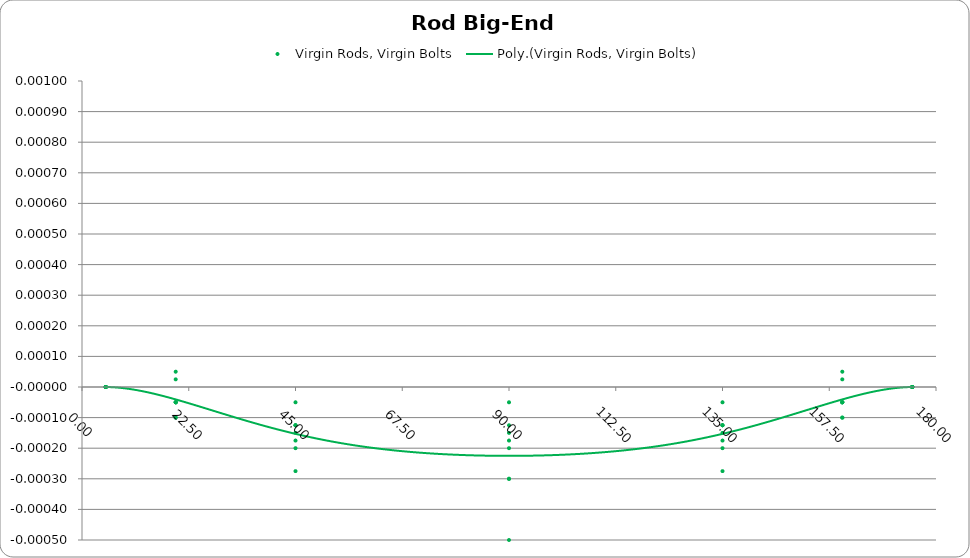
| Category | Virgin Rods, Virgin Bolts |
|---|---|
| 5.0 | 0 |
| 5.0 | 0 |
| 5.0 | 0 |
| 5.0 | 0 |
| 5.0 | 0 |
| 5.0 | 0 |
| 5.0 | 0 |
| 5.0 | 0 |
| 19.75 | 0 |
| 19.75 | 0 |
| 19.75 | 0 |
| 19.75 | 0 |
| 19.75 | 0 |
| 19.75 | 0 |
| 19.75 | 0 |
| 19.75 | 0 |
| 45.0 | 0 |
| 45.0 | 0 |
| 45.0 | 0 |
| 45.0 | 0 |
| 45.0 | 0 |
| 45.0 | 0 |
| 45.0 | 0 |
| 45.0 | 0 |
| 90.0 | 0 |
| 90.0 | 0 |
| 90.0 | 0 |
| 90.0 | 0 |
| 90.0 | 0 |
| 90.0 | -0.001 |
| 90.0 | 0 |
| 90.0 | 0 |
| 135.0 | 0 |
| 135.0 | 0 |
| 135.0 | 0 |
| 135.0 | 0 |
| 135.0 | 0 |
| 135.0 | 0 |
| 135.0 | 0 |
| 135.0 | 0 |
| 160.25 | 0 |
| 160.25 | 0 |
| 160.25 | 0 |
| 160.25 | 0 |
| 160.25 | 0 |
| 160.25 | 0 |
| 160.25 | 0 |
| 160.25 | 0 |
| 175.0 | 0 |
| 175.0 | 0 |
| 175.0 | 0 |
| 175.0 | 0 |
| 175.0 | 0 |
| 175.0 | 0 |
| 175.0 | 0 |
| 175.0 | 0 |